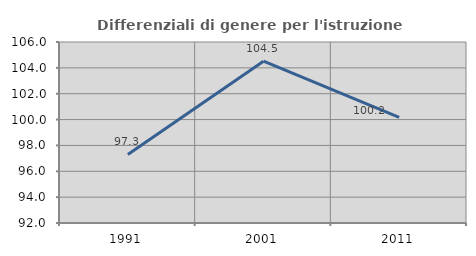
| Category | Differenziali di genere per l'istruzione superiore |
|---|---|
| 1991.0 | 97.305 |
| 2001.0 | 104.514 |
| 2011.0 | 100.162 |